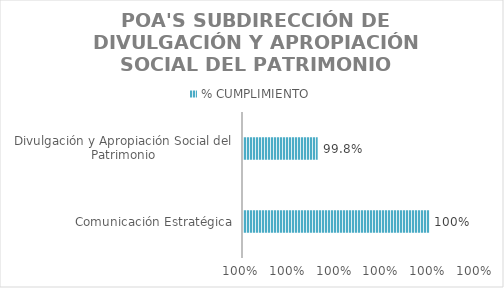
| Category | % CUMPLIMIENTO |
|---|---|
| Comunicación Estratégica | 1 |
| Divulgación y Apropiación Social del Patrimonio | 0.998 |